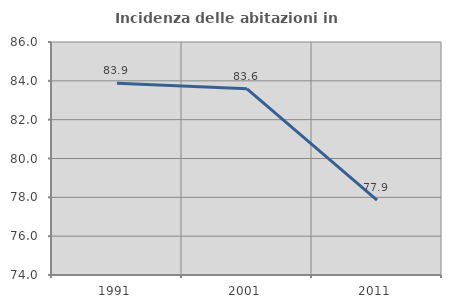
| Category | Incidenza delle abitazioni in proprietà  |
|---|---|
| 1991.0 | 83.871 |
| 2001.0 | 83.588 |
| 2011.0 | 77.852 |